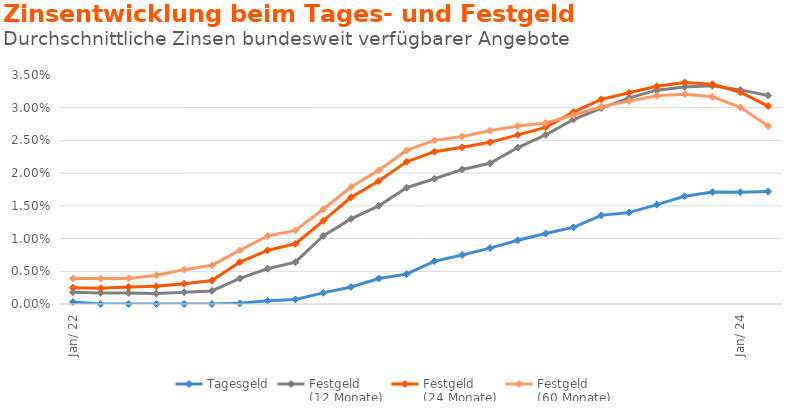
| Category | Tagesgeld | Festgeld 
(12 Monate) | Festgeld 
(24 Monate) | Festgeld 
(60 Monate) |
|---|---|---|---|---|
| 2022-01-01 | 0 | 0.002 | 0.002 | 0.004 |
| 2022-02-01 | 0 | 0.002 | 0.002 | 0.004 |
| 2022-03-01 | 0 | 0.002 | 0.003 | 0.004 |
| 2022-04-01 | 0 | 0.002 | 0.003 | 0.004 |
| 2022-05-01 | 0 | 0.002 | 0.003 | 0.005 |
| 2022-06-01 | 0 | 0.002 | 0.004 | 0.006 |
| 2022-07-01 | 0 | 0.004 | 0.006 | 0.008 |
| 2022-08-01 | 0 | 0.005 | 0.008 | 0.01 |
| 2022-09-01 | 0.001 | 0.006 | 0.009 | 0.011 |
| 2022-10-01 | 0.002 | 0.01 | 0.013 | 0.014 |
| 2022-11-01 | 0.003 | 0.013 | 0.016 | 0.018 |
| 2022-12-01 | 0.004 | 0.015 | 0.019 | 0.02 |
| 2023-01-01 | 0.005 | 0.018 | 0.022 | 0.023 |
| 2023-02-01 | 0.007 | 0.019 | 0.023 | 0.025 |
| 2023-03-01 | 0.007 | 0.021 | 0.024 | 0.026 |
| 2023-04-01 | 0.009 | 0.022 | 0.025 | 0.026 |
| 2023-05-01 | 0.01 | 0.024 | 0.026 | 0.027 |
| 2023-06-01 | 0.011 | 0.026 | 0.027 | 0.028 |
| 2023-07-01 | 0.012 | 0.028 | 0.029 | 0.029 |
| 2023-08-01 | 0.014 | 0.03 | 0.031 | 0.03 |
| 2023-09-01 | 0.014 | 0.032 | 0.032 | 0.031 |
| 2023-10-01 | 0.015 | 0.033 | 0.033 | 0.032 |
| 2023-11-01 | 0.016 | 0.033 | 0.034 | 0.032 |
| 2023-12-01 | 0.017 | 0.033 | 0.034 | 0.032 |
| 2024-01-01 | 0.017 | 0.033 | 0.032 | 0.03 |
| 2024-02-01 | 0.017 | 0.032 | 0.03 | 0.027 |